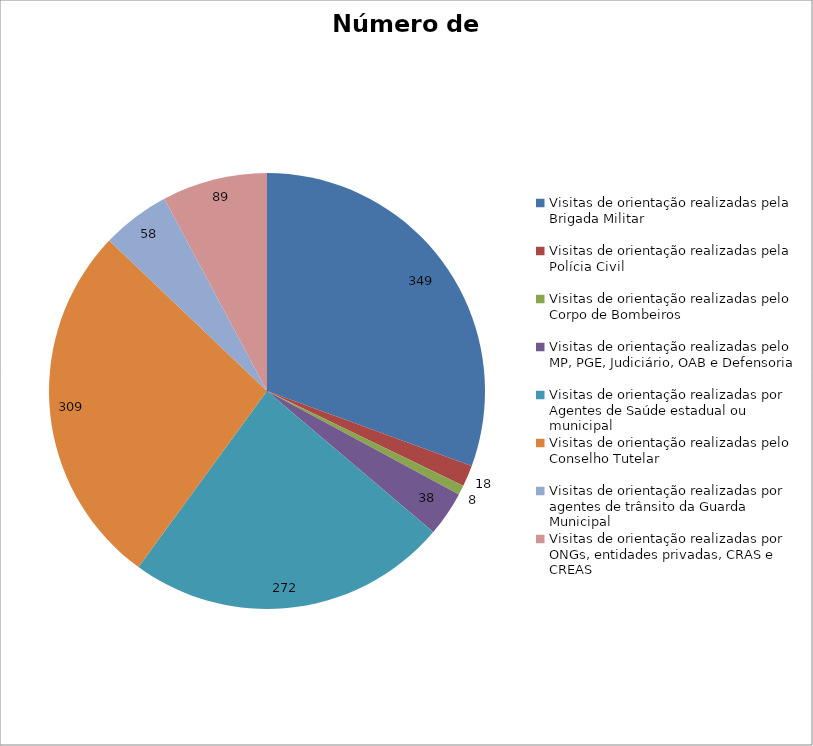
| Category | Número de Ações |
|---|---|
| Visitas de orientação realizadas pela Brigada Militar | 349 |
| Visitas de orientação realizadas pela Polícia Civil | 18 |
| Visitas de orientação realizadas pelo Corpo de Bombeiros | 8 |
| Visitas de orientação realizadas pelo MP, PGE, Judiciário, OAB e Defensoria | 38 |
| Visitas de orientação realizadas por Agentes de Saúde estadual ou municipal | 272 |
| Visitas de orientação realizadas pelo Conselho Tutelar | 309 |
| Visitas de orientação realizadas por agentes de trânsito da Guarda Municipal | 58 |
| Visitas de orientação realizadas por ONGs, entidades privadas, CRAS e CREAS | 89 |